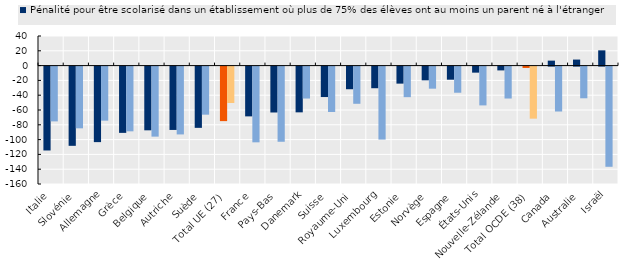
| Category | Pénalité pour être scolarisé dans un établissement où plus de 75% des élèves ont au moins un parent né à l'étranger | Pénalité pour être scolarisé dans un établissement où plus de 25% des élèves ont une mère ayant un faible niveau d’éducation |
|---|---|---|
| Italie | -113.352 | -74.036 |
| Slovénie | -107.063 | -83.415 |
| Allemagne | -102.056 | -73.043 |
| Grèce | -89.562 | -87.466 |
| Belgique | -86.102 | -94.634 |
| Autriche | -85.597 | -91.663 |
| Suède | -82.767 | -64.964 |
| Total UE (27) | -73.673 | -49.155 |
| France | -67.265 | -102.33 |
| Pays-Bas | -62.013 | -101.572 |
| Danemark | -61.819 | -43.171 |
| Suisse | -41.137 | -61.389 |
| Royaume-Uni | -30.582 | -50.245 |
| Luxembourg | -29.231 | -98.638 |
| Estonie | -23.01 | -41.313 |
| Norvège | -18.563 | -29.827 |
| Espagne | -17.695 | -35.302 |
| États-Unis | -8.177 | -52.433 |
| Nouvelle-Zélande | -5.14 | -43.148 |
| Total OCDE (38) | -1.852 | -70.356 |
| Canada | 6.7 | -60.7 |
| Australie | 8.147 | -42.824 |
| Israël | 20.614 | -135.387 |